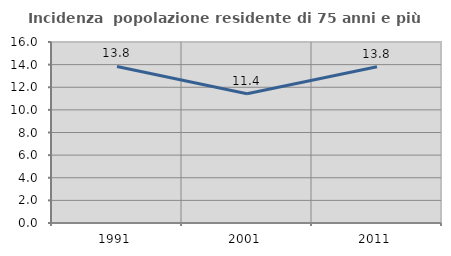
| Category | Incidenza  popolazione residente di 75 anni e più |
|---|---|
| 1991.0 | 13.842 |
| 2001.0 | 11.429 |
| 2011.0 | 13.818 |